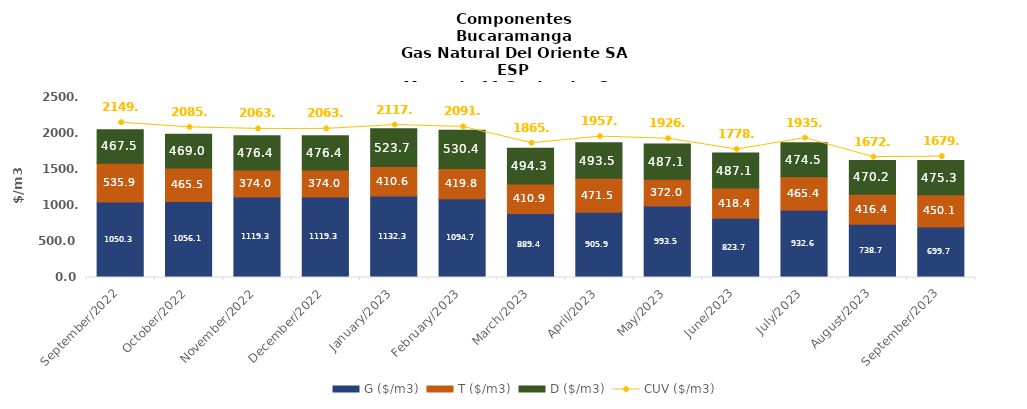
| Category | G ($/m3) | T ($/m3) | D ($/m3) |
|---|---|---|---|
| 2022-09-01 | 1050.31 | 535.9 | 467.52 |
| 2022-10-01 | 1056.07 | 465.54 | 469.03 |
| 2022-11-01 | 1119.25 | 374.03 | 476.36 |
| 2022-12-01 | 1119.25 | 374.03 | 476.36 |
| 2023-01-01 | 1132.3 | 410.55 | 523.74 |
| 2023-02-01 | 1094.71 | 419.79 | 530.39 |
| 2023-03-01 | 889.39 | 410.92 | 494.25 |
| 2023-04-01 | 905.91 | 471.46 | 493.54 |
| 2023-05-01 | 993.53 | 372.04 | 487.06 |
| 2023-06-01 | 823.66 | 418.43 | 487.06 |
| 2023-07-01 | 932.63 | 465.37 | 474.47 |
| 2023-08-01 | 738.7 | 416.42 | 470.2 |
| 2023-09-01 | 699.68 | 450.11 | 475.33 |